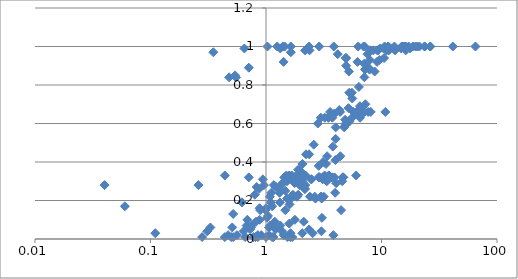
| Category | Series 0 |
|---|---|
| 65.14 | 1 |
| 41.46 | 1 |
| 26.5 | 1 |
| 26.33 | 1 |
| 23.69 | 1 |
| 23.59 | 1 |
| 21.32 | 1 |
| 20.4 | 1 |
| 19.69 | 1 |
| 18.69 | 1 |
| 17.17 | 1 |
| 16.2 | 1 |
| 16.0 | 1 |
| 15.73 | 1 |
| 15.36 | 1 |
| 15.13 | 1 |
| 14.96 | 1 |
| 12.94 | 1 |
| 11.46 | 1 |
| 11.37 | 1 |
| 10.63 | 1 |
| 7.14 | 1 |
| 7.0 | 1 |
| 6.29 | 1 |
| 3.86 | 1 |
| 2.89 | 1 |
| 2.36 | 1 |
| 1.64 | 1 |
| 1.45 | 1 |
| 1.4 | 1 |
| 1.25 | 1 |
| 1.03 | 1 |
| 17.6 | 0.99 |
| 14.79 | 0.99 |
| 11.98 | 0.99 |
| 10.42 | 0.99 |
| 9.74 | 0.99 |
| 1.33 | 0.99 |
| 0.65 | 0.99 |
| 16.19 | 0.98 |
| 13.09 | 0.98 |
| 11.55 | 0.98 |
| 11.46 | 0.98 |
| 10.98 | 0.98 |
| 9.35 | 0.98 |
| 9.24 | 0.98 |
| 9.21 | 0.98 |
| 8.49 | 0.98 |
| 8.01 | 0.98 |
| 2.38 | 0.98 |
| 2.18 | 0.98 |
| 1.64 | 0.97 |
| 0.35 | 0.97 |
| 7.56 | 0.96 |
| 4.18 | 0.96 |
| 10.53 | 0.94 |
| 4.95 | 0.94 |
| 4.89 | 0.94 |
| 9.58 | 0.93 |
| 7.92 | 0.93 |
| 9.15 | 0.92 |
| 6.2 | 0.92 |
| 1.42 | 0.92 |
| 7.07 | 0.91 |
| 4.94 | 0.9 |
| 7.73 | 0.89 |
| 0.71 | 0.89 |
| 7.88 | 0.88 |
| 7.19 | 0.88 |
| 8.73 | 0.87 |
| 5.22 | 0.87 |
| 0.54 | 0.85 |
| 7.11 | 0.84 |
| 0.55 | 0.84 |
| 0.48 | 0.84 |
| 6.37 | 0.79 |
| 5.54 | 0.76 |
| 5.26 | 0.76 |
| 5.58 | 0.73 |
| 7.25 | 0.7 |
| 6.51 | 0.69 |
| 5.17 | 0.68 |
| 6.7 | 0.67 |
| 6.6 | 0.67 |
| 6.52 | 0.67 |
| 6.3 | 0.67 |
| 4.31 | 0.67 |
| 10.8 | 0.66 |
| 8.07 | 0.66 |
| 7.66 | 0.66 |
| 7.14 | 0.66 |
| 7.03 | 0.66 |
| 5.72 | 0.66 |
| 4.38 | 0.66 |
| 3.59 | 0.66 |
| 6.33 | 0.65 |
| 6.33 | 0.65 |
| 6.27 | 0.65 |
| 6.24 | 0.65 |
| 3.89 | 0.65 |
| 3.89 | 0.65 |
| 6.52 | 0.63 |
| 5.56 | 0.63 |
| 3.75 | 0.63 |
| 3.47 | 0.63 |
| 3.46 | 0.63 |
| 3.23 | 0.63 |
| 2.98 | 0.63 |
| 4.85 | 0.62 |
| 5.27 | 0.61 |
| 4.91 | 0.6 |
| 2.81 | 0.6 |
| 4.86 | 0.59 |
| 4.75 | 0.58 |
| 4.01 | 0.58 |
| 4.01 | 0.52 |
| 2.59 | 0.49 |
| 3.79 | 0.48 |
| 2.36 | 0.44 |
| 2.22 | 0.44 |
| 4.4 | 0.43 |
| 3.38 | 0.43 |
| 3.99 | 0.41 |
| 3.12 | 0.4 |
| 3.31 | 0.39 |
| 2.07 | 0.39 |
| 2.86 | 0.38 |
| 1.9 | 0.36 |
| 2.01 | 0.35 |
| 6.03 | 0.33 |
| 3.5 | 0.33 |
| 3.5 | 0.33 |
| 3.22 | 0.33 |
| 2.19 | 0.33 |
| 2.19 | 0.33 |
| 2.03 | 0.33 |
| 2.01 | 0.33 |
| 1.84 | 0.33 |
| 1.67 | 0.33 |
| 1.59 | 0.33 |
| 1.5 | 0.33 |
| 0.44 | 0.33 |
| 4.66 | 0.32 |
| 4.66 | 0.32 |
| 4.61 | 0.32 |
| 3.92 | 0.32 |
| 3.75 | 0.32 |
| 3.7 | 0.32 |
| 3.11 | 0.32 |
| 3.11 | 0.32 |
| 2.9 | 0.32 |
| 2.9 | 0.32 |
| 2.9 | 0.32 |
| 2.87 | 0.32 |
| 2.87 | 0.32 |
| 2.87 | 0.32 |
| 2.87 | 0.32 |
| 2.04 | 0.32 |
| 1.94 | 0.32 |
| 1.94 | 0.32 |
| 1.94 | 0.32 |
| 1.94 | 0.32 |
| 1.79 | 0.32 |
| 1.79 | 0.32 |
| 1.79 | 0.32 |
| 1.79 | 0.32 |
| 1.79 | 0.32 |
| 1.79 | 0.32 |
| 1.79 | 0.32 |
| 1.79 | 0.32 |
| 1.79 | 0.32 |
| 1.79 | 0.32 |
| 1.79 | 0.32 |
| 1.79 | 0.32 |
| 1.79 | 0.32 |
| 1.44 | 0.32 |
| 0.71 | 0.32 |
| 3.1 | 0.31 |
| 2.47 | 0.31 |
| 2.47 | 0.31 |
| 1.67 | 0.31 |
| 0.94 | 0.31 |
| 4.57 | 0.3 |
| 3.36 | 0.3 |
| 2.07 | 0.3 |
| 1.52 | 0.3 |
| 4.05 | 0.29 |
| 1.92 | 0.29 |
| 1.77 | 0.29 |
| 1.39 | 0.29 |
| 2.19 | 0.28 |
| 1.95 | 0.28 |
| 1.35 | 0.28 |
| 1.17 | 0.28 |
| 0.96 | 0.28 |
| 0.26 | 0.28 |
| 0.04 | 0.28 |
| 1.22 | 0.27 |
| 0.83 | 0.27 |
| 2.17 | 0.26 |
| 2.17 | 0.26 |
| 1.28 | 0.26 |
| 1.28 | 0.26 |
| 0.87 | 0.26 |
| 1.47 | 0.25 |
| 1.33 | 0.25 |
| 3.97 | 0.24 |
| 1.31 | 0.24 |
| 1.11 | 0.24 |
| 1.9 | 0.23 |
| 1.71 | 0.23 |
| 0.8 | 0.23 |
| 3.16 | 0.22 |
| 2.99 | 0.22 |
| 2.99 | 0.22 |
| 2.64 | 0.22 |
| 2.4 | 0.22 |
| 1.86 | 0.22 |
| 1.85 | 0.22 |
| 1.08 | 0.22 |
| 3.03 | 0.21 |
| 2.68 | 0.21 |
| 1.65 | 0.21 |
| 1.52 | 0.21 |
| 1.32 | 0.19 |
| 1.1 | 0.19 |
| 0.62 | 0.19 |
| 0.62 | 0.19 |
| 1.6 | 0.18 |
| 1.13 | 0.17 |
| 0.06 | 0.17 |
| 1.0 | 0.16 |
| 0.88 | 0.16 |
| 4.47 | 0.15 |
| 1.47 | 0.15 |
| 0.99 | 0.15 |
| 0.89 | 0.15 |
| 0.52 | 0.13 |
| 1.04 | 0.12 |
| 3.05 | 0.11 |
| 1.02 | 0.11 |
| 1.78 | 0.1 |
| 0.88 | 0.1 |
| 0.69 | 0.1 |
| 2.12 | 0.09 |
| 1.19 | 0.09 |
| 0.82 | 0.09 |
| 1.59 | 0.08 |
| 1.33 | 0.07 |
| 1.11 | 0.07 |
| 1.09 | 0.07 |
| 0.75 | 0.07 |
| 0.68 | 0.07 |
| 1.06 | 0.06 |
| 0.74 | 0.06 |
| 0.72 | 0.06 |
| 0.51 | 0.06 |
| 0.33 | 0.06 |
| 2.36 | 0.05 |
| 1.21 | 0.05 |
| 0.73 | 0.05 |
| 3.02 | 0.04 |
| 1.38 | 0.04 |
| 0.64 | 0.04 |
| 0.31 | 0.04 |
| 2.53 | 0.03 |
| 2.06 | 0.03 |
| 1.63 | 0.03 |
| 0.11 | 0.03 |
| 3.83 | 0.02 |
| 1.6 | 0.02 |
| 1.42 | 0.02 |
| 1.06 | 0.02 |
| 0.91 | 0.02 |
| 0.85 | 0.02 |
| 0.56 | 0.02 |
| 0.47 | 0.02 |
| 1.69 | 0.01 |
| 1.62 | 0.01 |
| 1.53 | 0.01 |
| 1.16 | 0.01 |
| 1.13 | 0.01 |
| 1.0 | 0.01 |
| 0.85 | 0.01 |
| 0.81 | 0.01 |
| 0.78 | 0.01 |
| 0.66 | 0.01 |
| 0.52 | 0.01 |
| 0.5 | 0.01 |
| 0.44 | 0.01 |
| 0.28 | 0.01 |